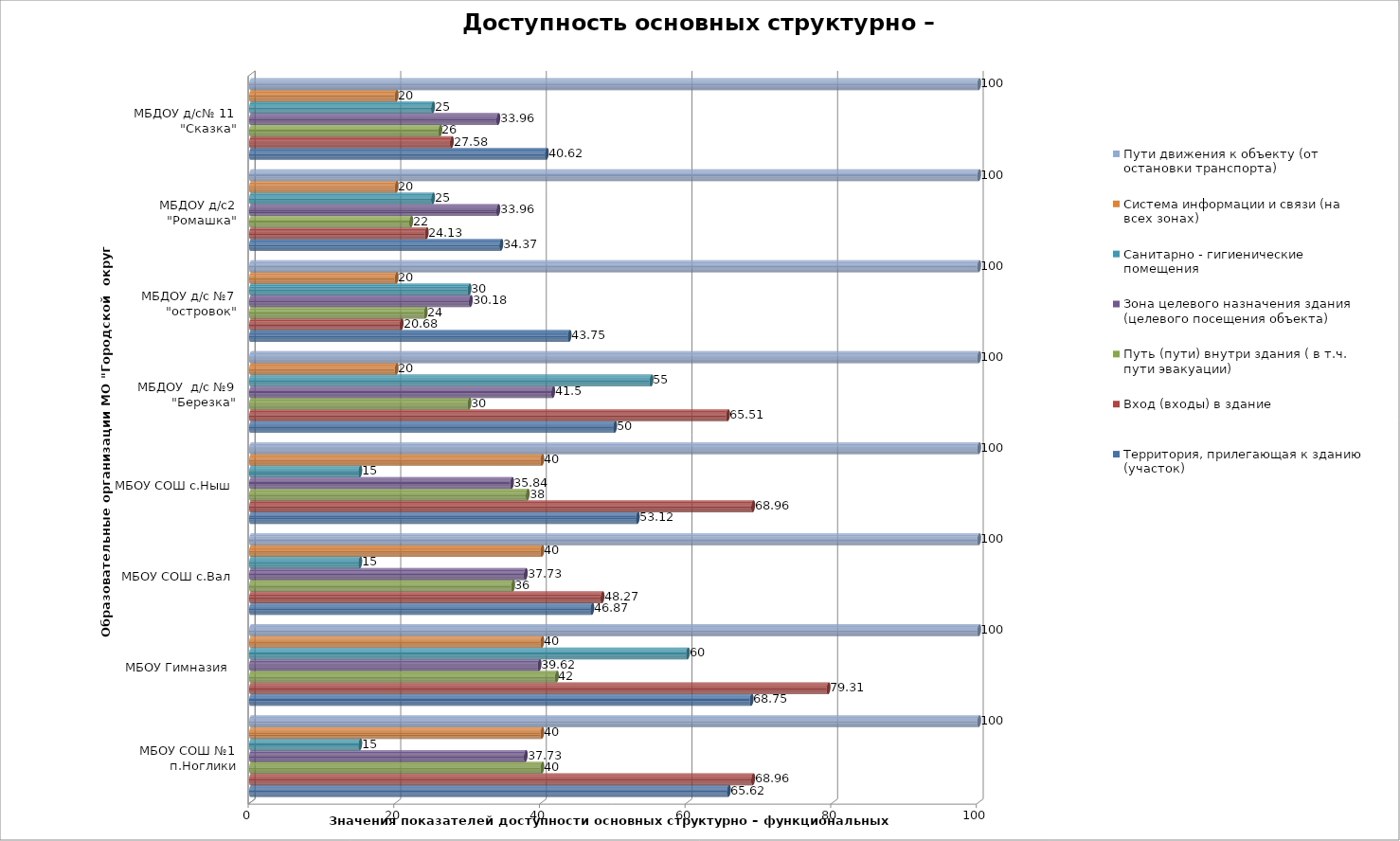
| Category | Территория, прилегающая к зданию (участок) 
 | Вход (входы) в здание | Путь (пути) внутри здания ( в т.ч. пути эвакуации) | Зона целевого назначения здания (целевого посещения объекта)  | Санитарно - гигиенические помещения | Система информации и связи (на всех зонах)  | Пути движения к объекту (от остановки транспорта)  |
|---|---|---|---|---|---|---|---|
| МБОУ СОШ №1 п.Ноглики | 65.62 | 68.96 | 40 | 37.73 | 15 | 40 | 100 |
| МБОУ Гимназия  | 68.75 | 79.31 | 42 | 39.62 | 60 | 40 | 100 |
| МБОУ СОШ с.Вал | 46.87 | 48.27 | 36 | 37.73 | 15 | 40 | 100 |
| МБОУ СОШ с.Ныш | 53.12 | 68.96 | 38 | 35.84 | 15 | 40 | 100 |
| МБДОУ  д/с №9 "Березка" | 50 | 65.51 | 30 | 41.5 | 55 | 20 | 100 |
| МБДОУ д/с №7 "островок" | 43.75 | 20.68 | 24 | 30.18 | 30 | 20 | 100 |
| МБДОУ д/с2 "Ромашка" | 34.37 | 24.13 | 22 | 33.96 | 25 | 20 | 100 |
| МБДОУ д/с№ 11 "Сказка" | 40.62 | 27.58 | 26 | 33.96 | 25 | 20 | 100 |